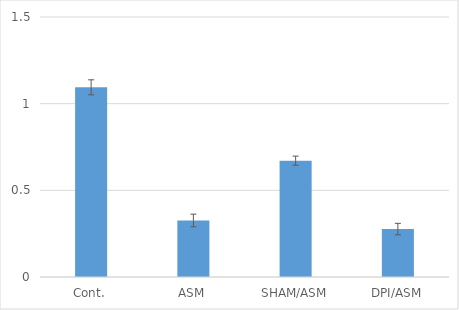
| Category | Series 0 |
|---|---|
| Cont. | 1.094 |
| ASM | 0.326 |
| SHAM/ASM | 0.671 |
| DPI/ASM | 0.276 |